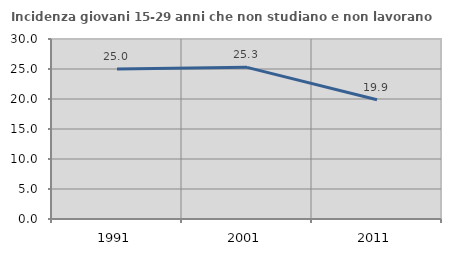
| Category | Incidenza giovani 15-29 anni che non studiano e non lavorano  |
|---|---|
| 1991.0 | 25 |
| 2001.0 | 25.275 |
| 2011.0 | 19.868 |